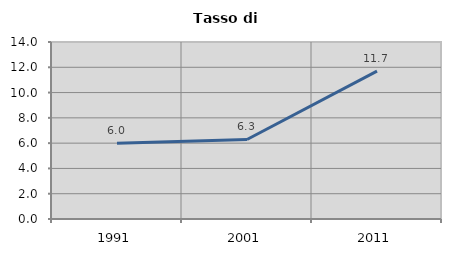
| Category | Tasso di disoccupazione   |
|---|---|
| 1991.0 | 6 |
| 2001.0 | 6.289 |
| 2011.0 | 11.696 |